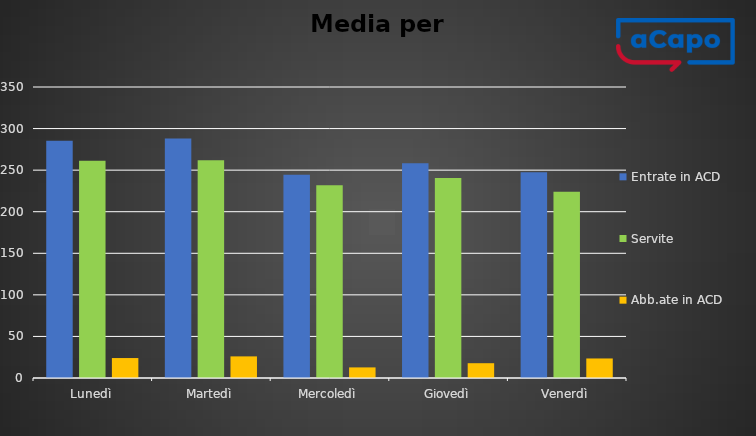
| Category | Entrate in ACD | Servite | Abb.ate in ACD |
|---|---|---|---|
| Lunedì | 285.25 | 261.25 | 24 |
| Martedì | 288 | 262 | 26 |
| Mercoledì | 244.5 | 231.75 | 12.75 |
| Giovedì | 258.4 | 240.6 | 17.8 |
| Venerdì | 247.5 | 224 | 23.5 |